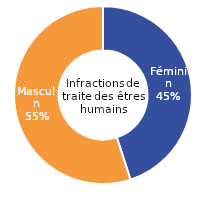
| Category | Infraction de traite des êtres humains |
|---|---|
| Féminin | 45 |
| Masculin | 55 |